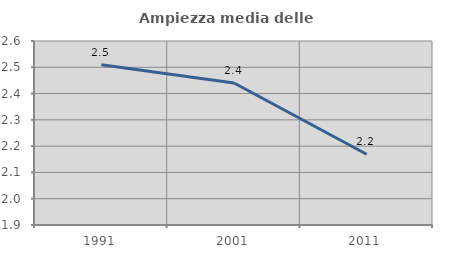
| Category | Ampiezza media delle famiglie |
|---|---|
| 1991.0 | 2.51 |
| 2001.0 | 2.44 |
| 2011.0 | 2.169 |